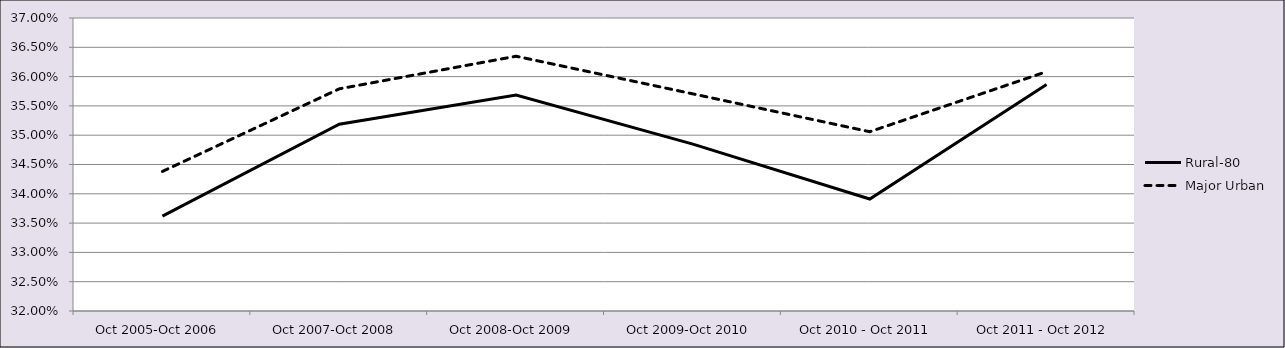
| Category | Rural-80 | Major Urban |
|---|---|---|
| Oct 2005-Oct 2006 | 0.336 | 0.344 |
| Oct 2007-Oct 2008 | 0.352 | 0.358 |
| Oct 2008-Oct 2009 | 0.357 | 0.363 |
| Oct 2009-Oct 2010 | 0.348 | 0.357 |
| Oct 2010 - Oct 2011 | 0.339 | 0.351 |
| Oct 2011 - Oct 2012 | 0.359 | 0.361 |